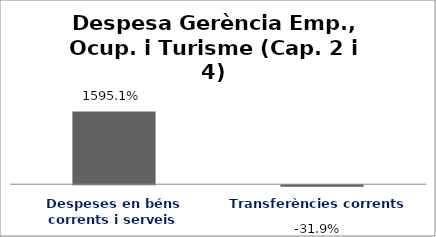
| Category | Series 0 |
|---|---|
| Despeses en béns corrents i serveis | 15.951 |
| Transferències corrents | -0.319 |